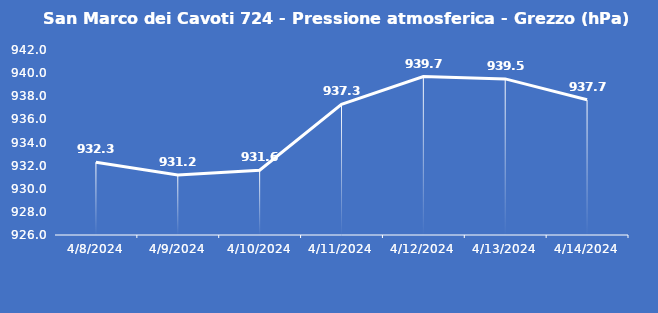
| Category | San Marco dei Cavoti 724 - Pressione atmosferica - Grezzo (hPa) |
|---|---|
| 4/8/24 | 932.3 |
| 4/9/24 | 931.2 |
| 4/10/24 | 931.6 |
| 4/11/24 | 937.3 |
| 4/12/24 | 939.7 |
| 4/13/24 | 939.5 |
| 4/14/24 | 937.7 |